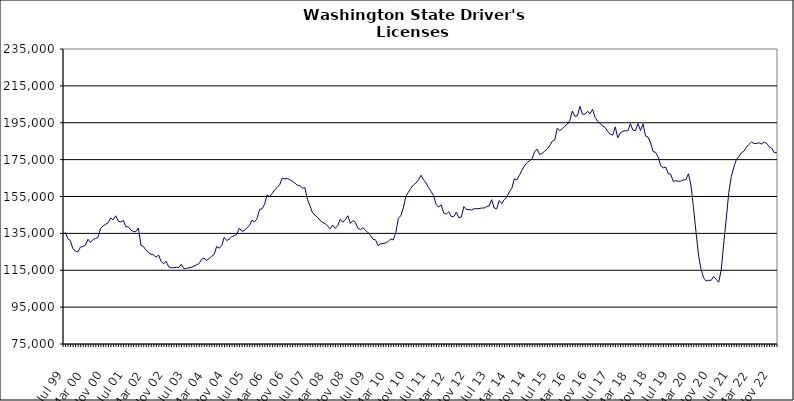
| Category | Series 0 |
|---|---|
| Jul 99 | 135560 |
| Aug 99 | 132182 |
| Sep 99 | 131104 |
| Oct 99 | 126694 |
| Nov 99 | 125425 |
| Dec 99 | 124927 |
| Jan 00 | 127499 |
| Feb 00 | 127927 |
| Mar 00 | 128547 |
| Apr 00 | 131834 |
| May 00 | 130120 |
| Jun 00 | 131595 |
| Jul 00 | 132236 |
| Aug 00 | 132819 |
| Sep 00 | 137711 |
| Oct 00 | 139063 |
| Nov 00 | 139952 |
| Dec 00 | 140732 |
| Jan 01 | 143338 |
| Feb 01 | 142359 |
| Mar 01 | 144523 |
| Apr 01 | 141758 |
| May 01 | 141135 |
| Jun 01 | 142064 |
| Jul 01 | 138646 |
| Aug 01 | 138530 |
| Sep 01 | 136784 |
| Oct 01 | 135996 |
| Nov 01 | 135917 |
| Dec 01 | 137940 |
| Jan 02 | 128531 |
| Feb 02 | 127848 |
| Mar 02 | 125876 |
| Apr 02 | 124595 |
| May 02 | 123660 |
| Jun 02 | 123282 |
| Jul 02 | 122089 |
| Aug 02 | 123279 |
| Sep 02 | 119727 |
| Oct 02 | 118588 |
| Nov 02 | 119854 |
| Dec 02 | 116851 |
| Jan 03 | 116407 |
| Feb 03 | 116382 |
| Mar 03 | 116648 |
| Apr 03 | 116471 |
| May 03 | 118231 |
| Jun 03 | 115831 |
| Jul 03 | 116082 |
| Aug 03 | 116341 |
| Sep 03 | 116653 |
| Oct 03 | 117212 |
| Nov 03 | 117962 |
| Dec 03 | 118542 |
| Jan 04 | 120817 |
| Feb 04 | 121617 |
| Mar 04 | 120369 |
| Apr 04 | 121200 |
| May 04 | 122609 |
| Jun 04 | 123484 |
| Jul 04 | 127844 |
| Aug 04 | 127025 |
| Sep 04 | 128273 |
| Oct 04 | 132853 |
| Nov 04 | 131106 |
| Dec 04 | 131935 |
| Jan 05 | 133205 |
| Feb 05 | 133736 |
| Mar 05 | 134528 |
| Apr 05 | 137889 |
| May 05 | 136130 |
| Jun 05 | 136523 |
| Jul 05 | 137997 |
| Aug 05 | 139294 |
| Sep 05 | 142140 |
| Oct 05 | 141192 |
| Nov 05 | 142937 |
| Dec 05 | 148013 |
| Jan 06 | 148341 |
| Feb 06 | 150744 |
| Mar 06 | 155794 |
| Apr 06 | 154984 |
| May 06 | 156651 |
| Jun 06 | 158638 |
| Jul 06 | 159911 |
| Aug 06 | 161445 |
| Sep 06 | 164852 |
| Oct 06 | 164570 |
| Nov 06 | 164679 |
| Dec 06 | 164127 |
| Jan 07 | 163271 |
| Feb 07 | 162273 |
| Mar 07 | 161140 |
| Apr 07 | 160860 |
| May 07 | 159633 |
| Jun 07 | 159724 |
| Jul 07 | 153303 |
| Aug 07 | 149939 |
| Sep 07 | 146172 |
| Oct 07 | 144876 |
| Nov 07 | 143613 |
| Dec 07 | 142022 |
| Jan 08 | 140909 |
| Feb 08 | 140368 |
| Mar 08 | 138998 |
| Apr 08 | 137471 |
| May 08 | 139453 |
| Jun 08 | 137680 |
| Jul 08 | 139120 |
| Aug 08 | 142612 |
| Sep-08 | 141071 |
| Oct 08 | 142313 |
| Nov 08 | 144556 |
| Dec 08 | 140394 |
| Jan 09 | 141903 |
| Feb 09 | 141036 |
| Mar 09 | 137751 |
| Apr 09 | 137060 |
| May 09 | 138101 |
| Jun 09 | 136739 |
| Jul 09 | 135317 |
| Aug 09 | 134020 |
| Sep 09 | 131756 |
| Oct 09 | 131488 |
| Nov 09 | 128370 |
| Dec 09 | 129323 |
| Jan 10 | 129531 |
| Feb 10 | 129848 |
| Mar 10 | 130654 |
| Apr 10 | 131929 |
| May 10 | 131429 |
| Jun 10 | 135357 |
| Jul 10 | 143032 |
| Aug 10 | 144686 |
| Sep 10 | 148856 |
| Oct 10 | 155042 |
| Nov 10 | 157328 |
| Dec 10 | 159501 |
| Jan 11 | 161221 |
| Feb 11 | 162312 |
| Mar 11 | 163996 |
| Apr 11 | 166495 |
| May 11 | 164040 |
| Jun 11 | 162324 |
| Jul 11 | 159862 |
| Aug 11 | 157738 |
| Sep 11 | 155430 |
| Oct 11 | 150762 |
| Nov 11 | 149255 |
| Dec 11 | 150533 |
| Jan 12 | 146068 |
| Feb 12 | 145446 |
| Mar 12 | 146788 |
| Apr 12 | 144110 |
| May 12 | 144162 |
| Jun 12 | 146482 |
| Jul 12 | 143445 |
| Aug 12 | 143950 |
| Sep 12 | 149520 |
| Oct 12 | 148033 |
| Nov 12 | 147926 |
| Dec 12 | 147674 |
| Jan 13 | 148360 |
| Feb-13 | 148388 |
| Mar-13 | 148414 |
| Apr 13 | 148749 |
| May 13 | 148735 |
| Jun-13 | 149521 |
| Jul 13 | 149837 |
| Aug 13 | 153252 |
| Sep 13 | 148803 |
| Oct 13 | 148315 |
| Nov 13 | 152804 |
| Dec 13 | 151209 |
| Jan 14 | 153357 |
| Feb-14 | 154608 |
| Mar 14 | 157479 |
| Apr 14 | 159441 |
| May 14 | 164591 |
| Jun 14 | 163995 |
| Jul-14 | 166411 |
| Aug-14 | 169272 |
| Sep 14 | 171565 |
| Oct 14 | 173335 |
| Nov 14 | 174406 |
| Dec 14 | 175302 |
| Jan 15 | 179204 |
| Feb 15 | 180737 |
| Mar 15 | 177810 |
| Apr-15 | 178331 |
| May 15 | 179601 |
| Jun-15 | 180729 |
| Jul 15 | 182540 |
| Aug 15 | 184924 |
| Sep 15 | 185620 |
| Oct 15 | 192002 |
| Nov 15 | 190681 |
| Dec 15 | 191795 |
| Jan 16 | 193132 |
| Feb 16 | 194206 |
| Mar 16 | 196319 |
| Apr 16 | 201373 |
| May 16 | 198500 |
| Jun 16 | 198743 |
| Jul 16 | 203841 |
| Aug 16 | 199630 |
| Sep 16 | 199655 |
| Oct 16 | 201181 |
| Nov 16 | 199888 |
| Dec 16 | 202304 |
| Jan 17 | 197977 |
| Feb 17 | 195889 |
| Mar 17 | 194438 |
| Apr 17 | 193335 |
| May 17 | 192430 |
| Jun 17 | 190298 |
| Jul 17 | 188832 |
| Aug 17 | 188264 |
| Sep 17 | 192738 |
| Oct 17 | 186856 |
| Nov 17 | 189537 |
| Dec 17 | 190341 |
| Jan 18 | 190670 |
| Feb 18 | 190645 |
| Mar 18 | 194476 |
| Apr 18 | 190971 |
| May 18 | 190707 |
| Jun 18 | 194516 |
| Jul 18 | 190783 |
| Aug 18 | 194390 |
| Sep 18 | 187831 |
| Oct 18 | 187188 |
| Nov 18 | 184054 |
| Dec 18 | 179347 |
| Jan 19 | 178958 |
| Feb 19 | 176289 |
| Mar 19 | 171747 |
| Apr 19 | 170532 |
| May 19 | 170967 |
| Jun 19 | 167444 |
| Jul 19 | 167059 |
| Aug 19 | 163194 |
| Sep 19 | 163599 |
| Oct 19 | 163212 |
| Nov 19 | 163388 |
| Dec 19 | 164024 |
| Jan 20 | 164114 |
| Feb 20 | 167320 |
| Mar 20 | 161221 |
| Apr 20 | 148866 |
| May 20 | 135821 |
| Jun 20 | 123252 |
| Jul 20 | 115526 |
| Aug 20 | 110940 |
| Sep 20 | 109099 |
| Oct 20 | 109566 |
| Nov 20 | 109488 |
| Dec 20 | 111658 |
| Jan 21 | 110070 |
| Feb 21 | 108491 |
| Mar 21 | 115176 |
| Apr 21 | 129726 |
| May 21 | 143052 |
| Jun 21 | 157253 |
| Jul 21 | 165832 |
| Aug 21 | 170937 |
| Sep 21 | 175042 |
| Oct 21 | 176696 |
| Nov 21 | 178677 |
| Dec 21 | 179501 |
| Jan 22 | 181825 |
| Feb 22 | 183258 |
| Mar 22 | 184618 |
| Apr 22 | 183710 |
| May 22 | 183784 |
| Jun 22 | 184101 |
| Jul 22 | 183443 |
| Aug 22 | 184475 |
| Sep 22 | 183902 |
| Oct 22 | 181994 |
| Nov 22 | 181207 |
| Dec 22 | 178793 |
| Jan 23 | 178782 |